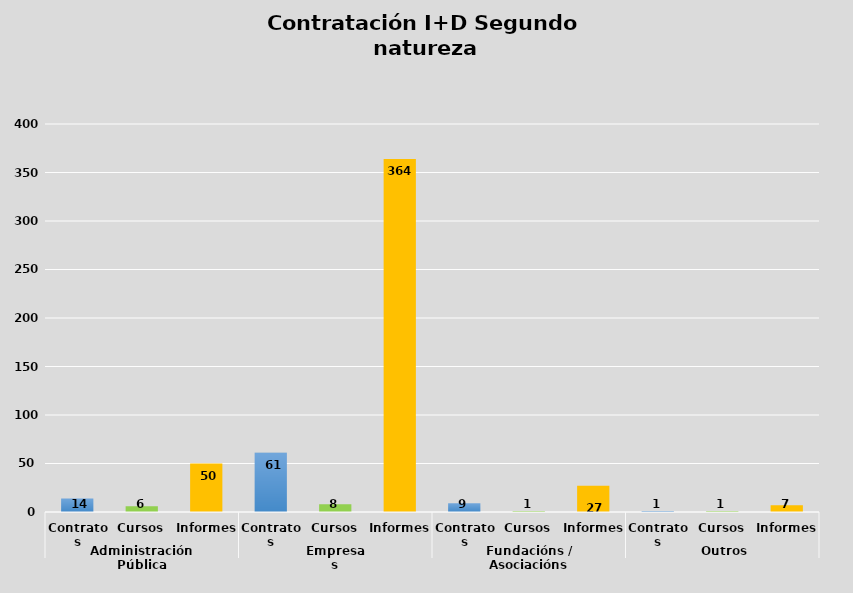
| Category | Series 0 |
|---|---|
| 0 | 14 |
| 1 | 6 |
| 2 | 50 |
| 3 | 61 |
| 4 | 8 |
| 5 | 364 |
| 6 | 9 |
| 7 | 1 |
| 8 | 27 |
| 9 | 1 |
| 10 | 1 |
| 11 | 7 |